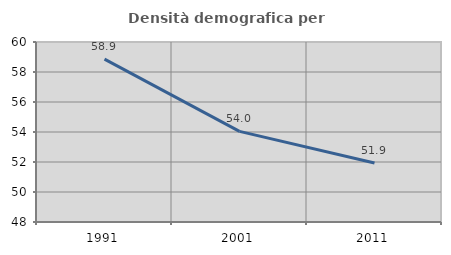
| Category | Densità demografica |
|---|---|
| 1991.0 | 58.861 |
| 2001.0 | 54.041 |
| 2011.0 | 51.938 |